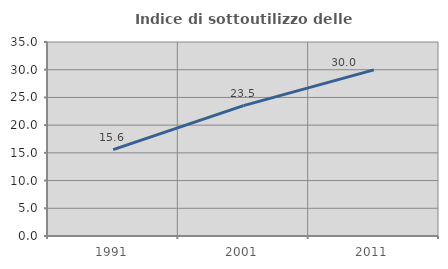
| Category | Indice di sottoutilizzo delle abitazioni  |
|---|---|
| 1991.0 | 15.584 |
| 2001.0 | 23.529 |
| 2011.0 | 29.967 |